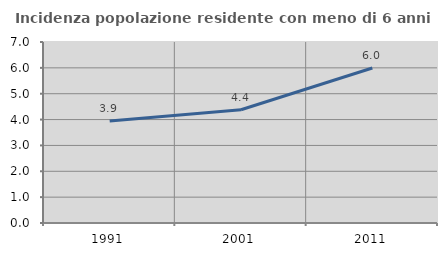
| Category | Incidenza popolazione residente con meno di 6 anni |
|---|---|
| 1991.0 | 3.943 |
| 2001.0 | 4.38 |
| 2011.0 | 5.994 |